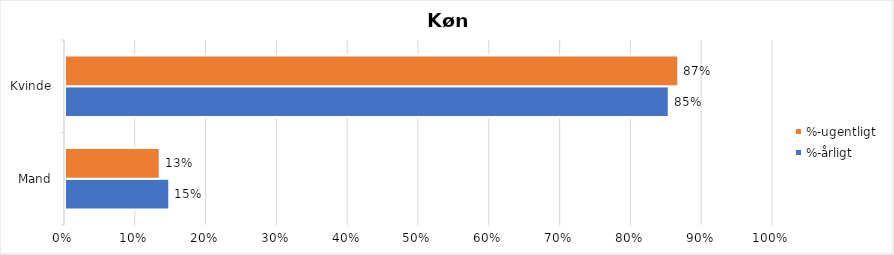
| Category | %-årligt | %-ugentligt |
|---|---|---|
| Mand | 0.147 | 0.134 |
| Kvinde | 0.853 | 0.866 |